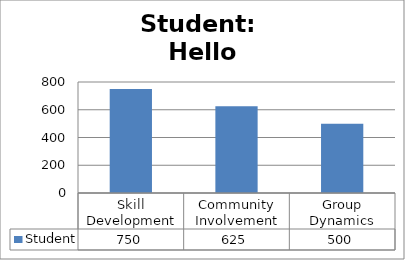
| Category | Student |
|---|---|
| Skill Development | 750 |
| Community Involvement | 625 |
| Group Dynamics | 500 |